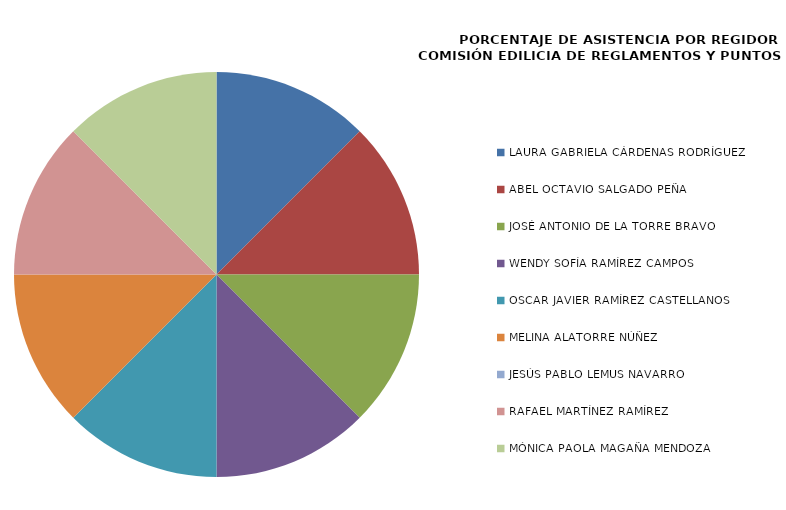
| Category | Series 0 |
|---|---|
| LAURA GABRIELA CÁRDENAS RODRÍGUEZ | 100 |
| ABEL OCTAVIO SALGADO PEÑA | 100 |
| JOSÉ ANTONIO DE LA TORRE BRAVO | 100 |
| WENDY SOFÍA RAMÍREZ CAMPOS | 100 |
| OSCAR JAVIER RAMÍREZ CASTELLANOS | 100 |
| MELINA ALATORRE NÚÑEZ | 100 |
| JESÚS PABLO LEMUS NAVARRO | 0 |
| RAFAEL MARTÍNEZ RAMÍREZ | 100 |
| MÓNICA PAOLA MAGAÑA MENDOZA | 100 |